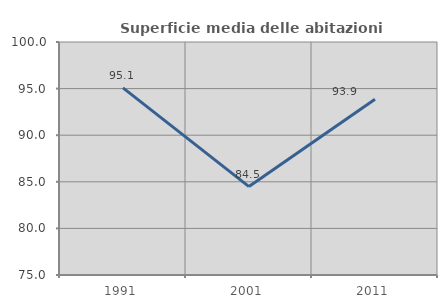
| Category | Superficie media delle abitazioni occupate |
|---|---|
| 1991.0 | 95.078 |
| 2001.0 | 84.488 |
| 2011.0 | 93.854 |